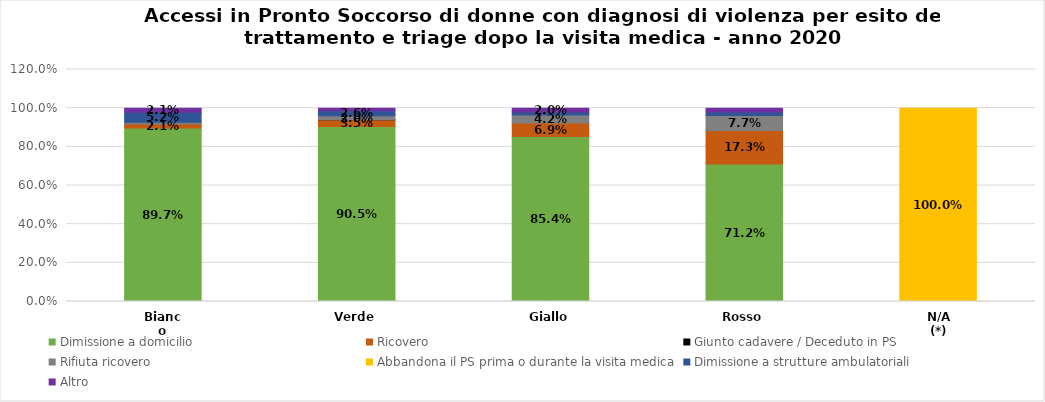
| Category | Dimissione a domicilio | Ricovero  | Giunto cadavere / Deceduto in PS | Rifiuta ricovero | Abbandona il PS prima o durante la visita medica | Dimissione a strutture ambulatoriali | Altro |
|---|---|---|---|---|---|---|---|
| Bianco | 0.897 | 0.021 | 0 | 0.009 | 0 | 0.052 | 0.021 |
| Verde | 0.905 | 0.035 | 0 | 0.02 | 0 | 0.026 | 0.013 |
| Giallo | 0.854 | 0.069 | 0 | 0.042 | 0 | 0.015 | 0.02 |
| Rosso | 0.712 | 0.173 | 0 | 0.077 | 0 | 0.019 | 0.019 |
| N/A (*) | 0 | 0 | 0 | 0 | 1 | 0 | 0 |